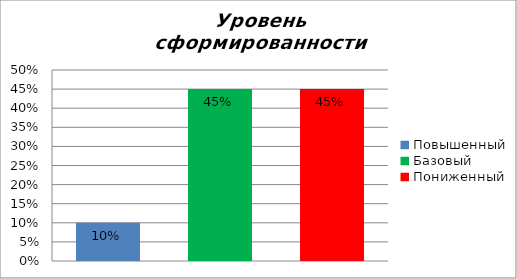
| Category | Уровень сформированности предметных результатов |
|---|---|
| Повышенный | 0.1 |
| Базовый | 0.45 |
| Пониженный | 0.45 |